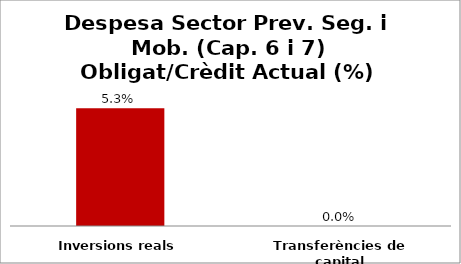
| Category | Series 0 |
|---|---|
| Inversions reals | 0.053 |
| Transferències de capital | 0 |